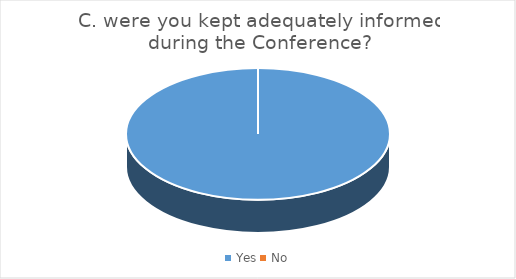
| Category | Series 0 |
|---|---|
| Yes | 30 |
| No | 0 |